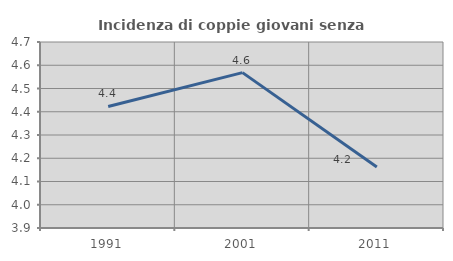
| Category | Incidenza di coppie giovani senza figli |
|---|---|
| 1991.0 | 4.423 |
| 2001.0 | 4.568 |
| 2011.0 | 4.162 |